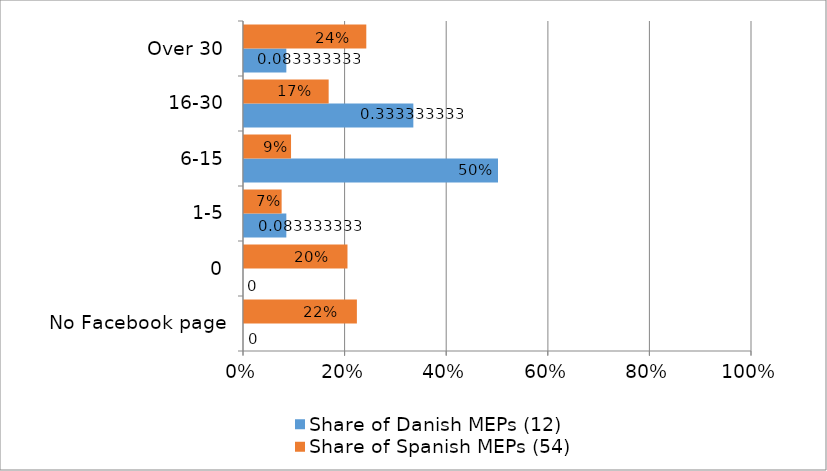
| Category | Share of Danish MEPs (12) | Share of Spanish MEPs (54) |
|---|---|---|
| No Facebook page | 0 | 0.222 |
| 0 | 0 | 0.204 |
| 1-5 | 0.083 | 0.074 |
| 6-15 | 0.5 | 0.093 |
| 16-30 | 0.333 | 0.167 |
| Over 30 | 0.083 | 0.241 |